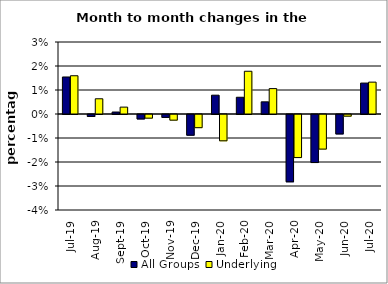
| Category | All Groups | Underlying |
|---|---|---|
| 2019-07-01 | 0.015 | 0.016 |
| 2019-08-01 | -0.001 | 0.006 |
| 2019-09-01 | 0.001 | 0.003 |
| 2019-10-01 | -0.002 | -0.002 |
| 2019-11-01 | -0.001 | -0.002 |
| 2019-12-01 | -0.009 | -0.005 |
| 2020-01-01 | 0.008 | -0.011 |
| 2020-02-01 | 0.007 | 0.018 |
| 2020-03-01 | 0.005 | 0.011 |
| 2020-04-01 | -0.028 | -0.018 |
| 2020-05-01 | -0.02 | -0.014 |
| 2020-06-01 | -0.008 | -0.001 |
| 2020-07-01 | 0.013 | 0.013 |